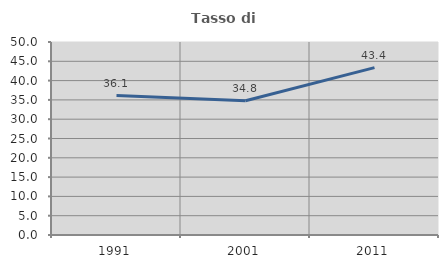
| Category | Tasso di occupazione   |
|---|---|
| 1991.0 | 36.111 |
| 2001.0 | 34.783 |
| 2011.0 | 43.373 |